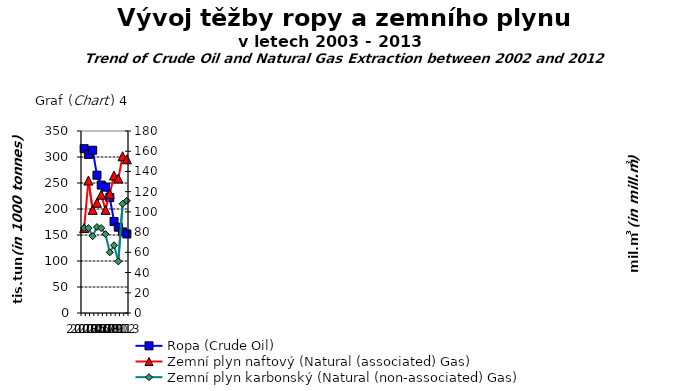
| Category | Ropa (Crude Oil) |
|---|---|
| 2003.0 | 316 |
| 2004.0 | 305 |
| 2005.0 | 313 |
| 2006.0 | 265 |
| 2007.0 | 246 |
| 2008.0 | 242 |
| 2009.0 | 222 |
| 2010.0 | 176 |
| 2011.0 | 165 |
| 2012.0 | 156 |
| 2013.0 | 152 |